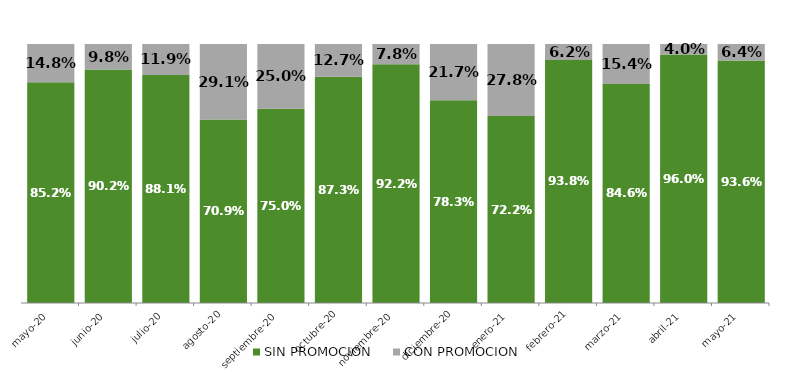
| Category | SIN PROMOCION   | CON PROMOCION   |
|---|---|---|
| 2020-05-01 | 0.852 | 0.148 |
| 2020-06-01 | 0.902 | 0.098 |
| 2020-07-01 | 0.881 | 0.119 |
| 2020-08-01 | 0.709 | 0.291 |
| 2020-09-01 | 0.75 | 0.25 |
| 2020-10-01 | 0.873 | 0.127 |
| 2020-11-01 | 0.922 | 0.078 |
| 2020-12-01 | 0.783 | 0.217 |
| 2021-01-01 | 0.722 | 0.278 |
| 2021-02-01 | 0.938 | 0.062 |
| 2021-03-01 | 0.846 | 0.154 |
| 2021-04-01 | 0.96 | 0.04 |
| 2021-05-01 | 0.936 | 0.064 |